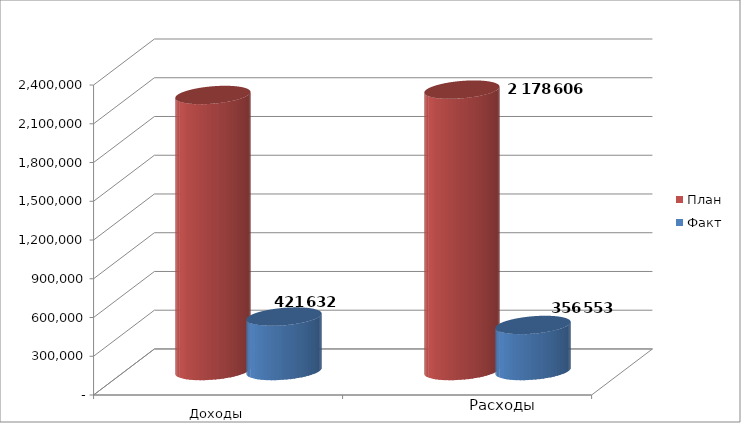
| Category | План | Факт |
|---|---|---|
| 0 | 2137231 | 421632 |
| 1 | 2178606 | 356553 |